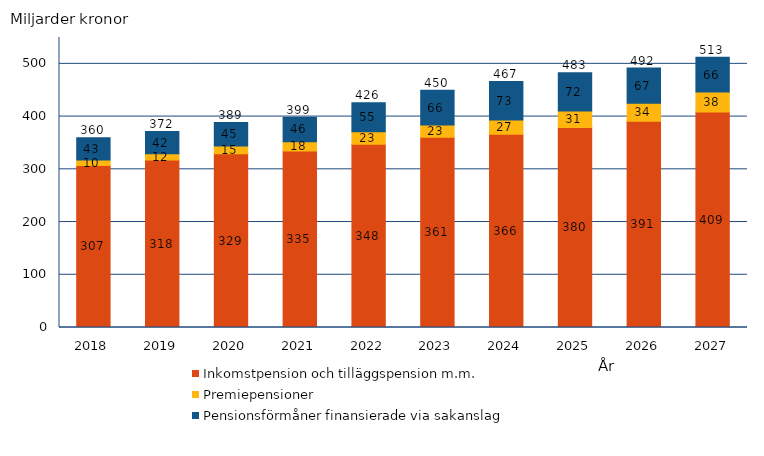
| Category | Inkomstpension och tilläggspension m.m. | Premiepensioner | Pensionsförmåner finansierade via sakanslag | Series 3 |
|---|---|---|---|---|
| 2018.0 | 307.356 | 10.141 | 42.55 | 360.046 |
| 2019.0 | 317.628 | 11.715 | 42.22 | 371.563 |
| 2020.0 | 329.365 | 15.016 | 44.546 | 388.927 |
| 2021.0 | 334.563 | 17.837 | 46.327 | 398.727 |
| 2022.0 | 347.77 | 23.477 | 55.057 | 426.303 |
| 2023.0 | 360.859 | 23.388 | 65.805 | 450.052 |
| 2024.0 | 366.299 | 27.36 | 73.027 | 466.686 |
| 2025.0 | 379.516 | 31.24 | 72.375 | 483.131 |
| 2026.0 | 391.149 | 34.244 | 66.7 | 492.093 |
| 2027.0 | 408.732 | 38.089 | 65.894 | 512.715 |